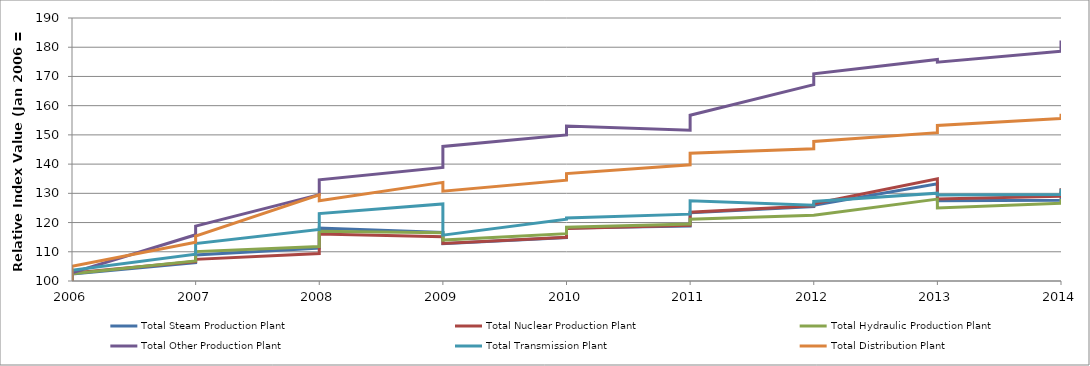
| Category | Total Steam Production Plant | Total Nuclear Production Plant | Total Hydraulic Production Plant | Total Other Production Plant | Total Transmission Plant | Total Distribution Plant |
|---|---|---|---|---|---|---|
| 2006-01-01 | 100 | 100 | 100 | 100 | 100 | 100 |
| 2006-07-01 | 102.376 | 102.759 | 102.473 | 102.791 | 103.704 | 105 |
| 2007-01-01 | 106.263 | 106.667 | 106.868 | 115.814 | 109.15 | 113.25 |
| 2007-07-01 | 108.906 | 107.415 | 110.058 | 118.791 | 112.807 | 115.359 |
| 2008-01-01 | 111.231 | 109.425 | 111.813 | 129.535 | 117.647 | 129.5 |
| 2008-07-01 | 118.143 | 116.092 | 117.033 | 134.651 | 123.094 | 127.5 |
| 2009-01-01 | 116.631 | 115.172 | 116.484 | 138.837 | 126.362 | 133.75 |
| 2009-07-01 | 112.743 | 112.874 | 114.011 | 146.047 | 115.686 | 130.75 |
| 2010-01-01 | 114.903 | 114.943 | 116.209 | 150 | 121.133 | 134.5 |
| 2010-07-01 | 118.143 | 117.931 | 118.407 | 153.023 | 121.569 | 136.75 |
| 2011-01-01 | 118.79 | 119.08 | 119.505 | 151.628 | 122.876 | 139.75 |
| 2011-07-01 | 123.326 | 123.563 | 121.154 | 156.744 | 127.451 | 143.75 |
| 2012-01-01 | 125.486 | 125.747 | 122.527 | 167.209 | 125.926 | 145.25 |
| 2012-07-01 | 125.918 | 126.437 | 122.802 | 170.93 | 127.233 | 147.75 |
| 2013-01-01 | 133.261 | 134.943 | 128.022 | 175.814 | 130.065 | 150.75 |
| 2013-07-01 | 127.43 | 128.046 | 125 | 174.884 | 129.412 | 153.25 |
| 2014-01-01 | 127.646 | 128.966 | 126.648 | 178.605 | 129.63 | 155.625 |
| 2014-07-01 | 130.67 | 131.724 | 128.022 | 182.326 | 131.59 | 157.25 |